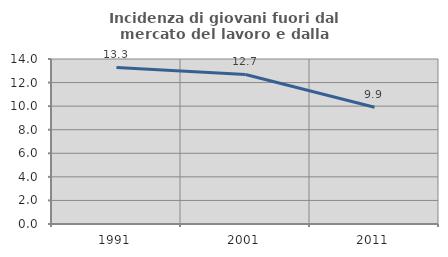
| Category | Incidenza di giovani fuori dal mercato del lavoro e dalla formazione  |
|---|---|
| 1991.0 | 13.288 |
| 2001.0 | 12.69 |
| 2011.0 | 9.904 |